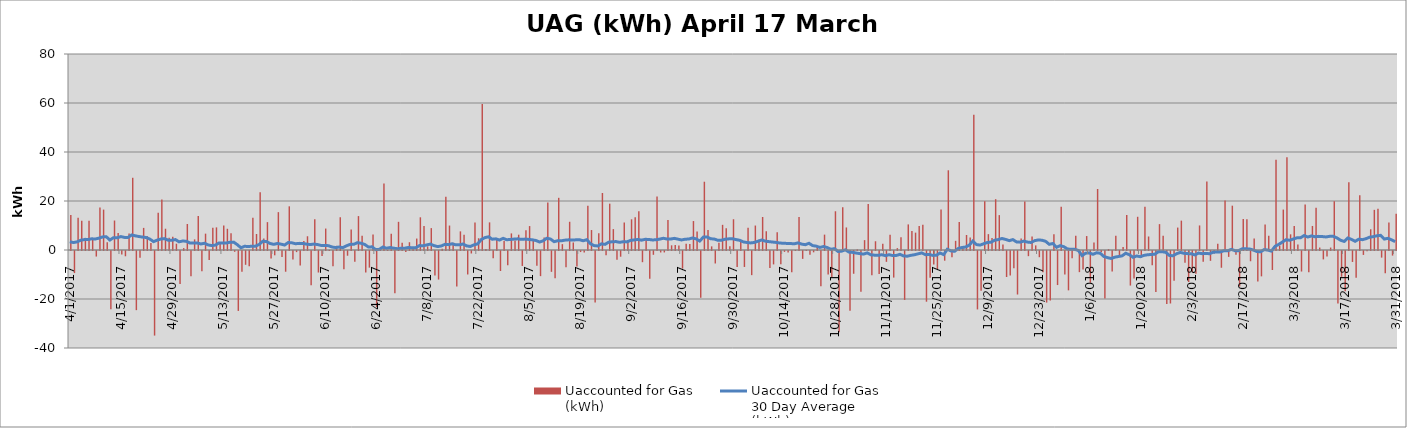
| Category | Uaccounted for Gas 
(kWh) |
|---|---|
| 0 | 14314398 |
| 1/1/00 | -9008049 |
| 1/2/00 | 13165006 |
| 1/3/00 | 11980030 |
| 1/4/00 | 4963694 |
| 1/5/00 | 11972930 |
| 1/6/00 | 4284250 |
| 1/7/00 | -2266329 |
| 1/8/00 | 17318408 |
| 1/9/00 | 16489319 |
| 1/10/00 | 3201172 |
| 1/11/00 | -23783681 |
| 1/12/00 | 12033013 |
| 1/13/00 | 6946573 |
| 1/14/00 | -1398838 |
| 1/15/00 | -2153866 |
| 1/16/00 | 6734255 |
| 1/17/00 | 29477750 |
| 1/18/00 | -24142769 |
| 1/19/00 | -2755645 |
| 1/20/00 | 9024930 |
| 1/21/00 | 5632530 |
| 1/22/00 | 2838750 |
| 1/23/00 | -34522814 |
| 1/24/00 | 15181135 |
| 1/25/00 | 20662476 |
| 1/26/00 | 8684997 |
| 1/27/00 | 5012384 |
| 1/28/00 | 5452508 |
| 1/29/00 | 2561052 |
| 1/30/00 | -13436861 |
| 1/31/00 | 770855 |
| 2/1/00 | 10612207 |
| 2/2/00 | -10261923 |
| 2/3/00 | 4332814 |
| 2/4/00 | 13850251 |
| 2/5/00 | -8300941 |
| 2/6/00 | 6675173 |
| 2/7/00 | -3719255 |
| 2/8/00 | 9099015 |
| 2/9/00 | 9231356 |
| 2/10/00 | 2527529 |
| 2/11/00 | 9999616 |
| 2/12/00 | 8661983 |
| 2/13/00 | 6830649 |
| 2/14/00 | -319115 |
| 2/15/00 | -24456047 |
| 2/16/00 | -8495750 |
| 2/17/00 | -5634607 |
| 2/18/00 | -6268354 |
| 2/19/00 | 13211002 |
| 2/20/00 | 6520097 |
| 2/21/00 | 23588603 |
| 2/22/00 | 4718145 |
| 2/23/00 | 11375251 |
| 2/24/00 | -3104794 |
| 2/25/00 | -1764475 |
| 2/26/00 | 15451648 |
| 2/27/00 | -2454022 |
| 2/28/00 | -8458312 |
| 2/28/00 | 17828688 |
| 3/1/00 | -3469632 |
| 3/2/00 | -459033 |
| 3/3/00 | -5878953 |
| 3/4/00 | 3650271 |
| 3/5/00 | 5610271 |
| 3/6/00 | -14008154 |
| 3/7/00 | 12502707 |
| 3/8/00 | -8779890 |
| 3/9/00 | -2033755 |
| 3/10/00 | 8749149 |
| 3/11/00 | 74535 |
| 3/12/00 | -6268696 |
| 3/13/00 | 1711995 |
| 3/14/00 | 13371018 |
| 3/15/00 | -7479051 |
| 3/16/00 | -1931623 |
| 3/17/00 | 8329411 |
| 3/18/00 | -4363870 |
| 3/19/00 | 13840853 |
| 3/20/00 | 5807262 |
| 3/21/00 | -8752586 |
| 3/22/00 | -6791870 |
| 3/23/00 | 6328985 |
| 3/24/00 | -22918268 |
| 3/25/00 | 485343 |
| 3/26/00 | 27146947 |
| 3/27/00 | -11687 |
| 3/28/00 | 6641294 |
| 3/29/00 | -17247993 |
| 3/30/00 | 11500662 |
| 3/31/00 | 2912392 |
| 4/1/00 | -404406 |
| 4/2/00 | 3172298 |
| 4/3/00 | 457996 |
| 4/4/00 | 4668359 |
| 4/5/00 | 13345374 |
| 4/6/00 | 9758940 |
| 4/7/00 | 1476730 |
| 4/8/00 | 8936574 |
| 4/9/00 | -9950012 |
| 4/10/00 | -11652063 |
| 4/11/00 | 539320 |
| 4/12/00 | 21740747 |
| 4/13/00 | 9982116 |
| 4/14/00 | 2991532 |
| 4/15/00 | -14452145 |
| 4/16/00 | 7608446 |
| 4/17/00 | 6256930 |
| 4/18/00 | -9582820 |
| 4/19/00 | -1008950 |
| 4/20/00 | 11177220 |
| 4/21/00 | 4790190 |
| 4/22/00 | 59561910 |
| 4/23/00 | 411091 |
| 4/24/00 | 11280591 |
| 4/25/00 | -2969818 |
| 4/26/00 | 4697754 |
| 4/27/00 | -8173841 |
| 4/28/00 | 3713432 |
| 4/29/00 | -5779908 |
| 4/30/00 | 6777965 |
| 5/1/00 | 3865953 |
| 5/2/00 | 6247170 |
| 5/3/00 | -6100718 |
| 5/4/00 | 8058457 |
| 5/5/00 | 9769337 |
| 5/6/00 | 4290131 |
| 5/7/00 | -6012798 |
| 5/8/00 | -10263490 |
| 5/9/00 | 5130785 |
| 5/10/00 | 19347697 |
| 5/11/00 | -8506058 |
| 5/12/00 | -11088056 |
| 5/13/00 | 21298585 |
| 5/14/00 | 2395089 |
| 5/15/00 | -6582632 |
| 5/16/00 | 11526047 |
| 5/17/00 | 3065625 |
| 5/18/00 | -6377373 |
| 5/19/00 | -427718 |
| 5/20/00 | -661129 |
| 5/21/00 | 18014997 |
| 5/22/00 | 8147501 |
| 5/23/00 | -21000124 |
| 5/24/00 | 6871303 |
| 5/25/00 | 23259332 |
| 5/26/00 | -1778904 |
| 5/27/00 | 18914307 |
| 5/28/00 | 8528696 |
| 5/29/00 | -3559892 |
| 5/30/00 | -2331214 |
| 5/31/00 | 11199562 |
| 6/1/00 | 4073972 |
| 6/2/00 | 12524235 |
| 6/3/00 | 13402268 |
| 6/4/00 | 15819304 |
| 6/5/00 | -4565296 |
| 6/6/00 | 4160880 |
| 6/7/00 | -11291859 |
| 6/8/00 | -1553730 |
| 6/9/00 | 21791669 |
| 6/10/00 | -605213 |
| 6/11/00 | -586590 |
| 6/12/00 | 12234947 |
| 6/13/00 | 1906386 |
| 6/14/00 | 2003831 |
| 6/15/00 | 1872748 |
| 6/16/00 | -7165082 |
| 6/17/00 | 2569217 |
| 6/18/00 | 2414710 |
| 6/19/00 | 11816762 |
| 6/20/00 | 7525037 |
| 6/21/00 | -19128985 |
| 6/22/00 | 27869538 |
| 6/23/00 | 8145679 |
| 6/24/00 | 1481253 |
| 6/25/00 | -5093882 |
| 6/26/00 | 2915495 |
| 6/27/00 | 10276742 |
| 6/28/00 | 8911532 |
| 6/29/00 | 1497062 |
| 6/30/00 | 12554489 |
| 7/1/00 | -6485437 |
| 7/2/00 | 3823073 |
| 7/3/00 | -6516055 |
| 7/4/00 | 9043366 |
| 7/5/00 | -9853089 |
| 7/6/00 | 9982055 |
| 7/7/00 | 4176250 |
| 7/8/00 | 13480566 |
| 7/9/00 | 7656649 |
| 7/10/00 | -6893459 |
| 7/11/00 | -5473824 |
| 7/12/00 | 7222282 |
| 7/13/00 | -5451179 |
| 7/14/00 | -360365 |
| 7/15/00 | -635175 |
| 7/16/00 | -8703687 |
| 7/17/00 | 50713 |
| 7/18/00 | 13498452 |
| 7/19/00 | -3209181 |
| 7/20/00 | 37938 |
| 7/21/00 | -1531223 |
| 7/22/00 | -542519 |
| 7/23/00 | 1381128 |
| 7/24/00 | -14429932 |
| 7/25/00 | 6273827 |
| 7/26/00 | -9568338 |
| 7/27/00 | -10631093 |
| 7/28/00 | 15810011 |
| 7/29/00 | -33182493 |
| 7/30/00 | 17435871 |
| 7/31/00 | 9202714 |
| 8/1/00 | -24349058 |
| 8/2/00 | -9289946 |
| 8/3/00 | 247624 |
| 8/4/00 | -16643883 |
| 8/5/00 | 4031816 |
| 8/6/00 | 18784913 |
| 8/7/00 | -9860922 |
| 8/8/00 | 3570291 |
| 8/9/00 | -9358517 |
| 8/10/00 | 2527235 |
| 8/11/00 | -4424857 |
| 8/12/00 | 6232661 |
| 8/13/00 | -10852350 |
| 8/14/00 | 761097 |
| 8/15/00 | 5192391 |
| 8/16/00 | -19963240 |
| 8/17/00 | 10444669 |
| 8/18/00 | 7754229 |
| 8/19/00 | 7087094 |
| 8/20/00 | 9791004 |
| 8/21/00 | 10286689 |
| 8/22/00 | -20696026 |
| 8/23/00 | -10927548 |
| 8/24/00 | -5494994 |
| 8/25/00 | -7370713 |
| 8/26/00 | 16500524 |
| 8/27/00 | -3959574 |
| 8/28/00 | 32536026 |
| 8/29/00 | -2517418 |
| 8/30/00 | 3740842 |
| 8/31/00 | 11384513 |
| 9/1/00 | 1649723 |
| 9/2/00 | 6117443 |
| 9/3/00 | 5057684 |
| 9/4/00 | 55199323 |
| 9/5/00 | -23847299 |
| 9/6/00 | -16265439 |
| 9/7/00 | 19924133 |
| 9/8/00 | 6474109 |
| 9/9/00 | 4924506 |
| 9/10/00 | 20741360 |
| 9/11/00 | 14241737 |
| 9/12/00 | 2219157 |
| 9/13/00 | -10622514 |
| 9/14/00 | -9996465 |
| 9/15/00 | -6998770 |
| 9/16/00 | -17760673 |
| 9/17/00 | 4675197 |
| 9/18/00 | 19775008 |
| 9/19/00 | -2107006 |
| 9/20/00 | 5489507 |
| 9/21/00 | 1878752 |
| 9/22/00 | -2531172 |
| 9/23/00 | -8712952 |
| 9/24/00 | -21051382 |
| 9/25/00 | -20212140 |
| 9/26/00 | 6397294 |
| 9/27/00 | -13893722 |
| 9/28/00 | 17624793 |
| 9/29/00 | -9542029 |
| 9/30/00 | -16061899 |
| 10/1/00 | -2973911 |
| 10/2/00 | 5819391 |
| 10/3/00 | -8630135 |
| 10/4/00 | -7584058 |
| 10/5/00 | 5692742 |
| 10/6/00 | -12970607 |
| 10/7/00 | 3103714 |
| 10/8/00 | 24895995 |
| 10/9/00 | -458447 |
| 10/10/00 | -19369546 |
| 10/11/00 | 391145 |
| 10/12/00 | -8393638 |
| 10/13/00 | 5816280 |
| 10/14/00 | -2131074 |
| 10/15/00 | 1200884 |
| 10/16/00 | 14297902 |
| 10/17/00 | -14105827 |
| 10/18/00 | -11191914 |
| 10/19/00 | 13555663 |
| 10/20/00 | -2736173 |
| 10/21/00 | 17634985 |
| 10/22/00 | 5514267 |
| 10/23/00 | -5816082 |
| 10/24/00 | -16685565 |
| 10/25/00 | 10559687 |
| 10/26/00 | 5801833 |
| 10/27/00 | -21658925 |
| 10/28/00 | -21423684 |
| 10/29/00 | -12113338 |
| 10/30/00 | 9154710 |
| 10/31/00 | 11988677 |
| 11/1/00 | -4786251 |
| 11/2/00 | -12660129 |
| 11/3/00 | -8682874 |
| 11/4/00 | -9267526 |
| 11/5/00 | 10022840 |
| 11/6/00 | -4350055 |
| 11/7/00 | 27976623 |
| 11/8/00 | -4016519 |
| 11/9/00 | -1003294 |
| 11/10/00 | 2554194 |
| 11/11/00 | -6839281 |
| 11/12/00 | 20212496 |
| 11/13/00 | -2401877 |
| 11/14/00 | 18092024 |
| 11/15/00 | -1532210 |
| 11/16/00 | -14490500 |
| 11/17/00 | 12657615 |
| 11/18/00 | 12566486 |
| 11/19/00 | -4184086 |
| 11/20/00 | 4724286 |
| 11/21/00 | -12441508 |
| 11/22/00 | -10350051 |
| 11/23/00 | 10396619 |
| 11/24/00 | 5786881 |
| 11/25/00 | -7761996 |
| 11/26/00 | 36860203 |
| 11/27/00 | 1790394 |
| 11/28/00 | 16501379 |
| 11/29/00 | 37815424 |
| 11/30/00 | 6396415 |
| 12/1/00 | 9830526 |
| 12/2/00 | 2231617 |
| 12/3/00 | -8380362 |
| 12/4/00 | 18581279 |
| 12/5/00 | -8711146 |
| 12/6/00 | 9811456 |
| 12/7/00 | 17227780 |
| 12/8/00 | 999669 |
| 12/9/00 | -3428149 |
| 12/10/00 | -2258976 |
| 12/11/00 | 1003160 |
| 12/12/00 | 19906432 |
| 12/13/00 | -21393498 |
| 12/14/00 | -10511738 |
| 12/15/00 | -16468987 |
| 12/16/00 | 27645247 |
| 12/17/00 | -4471109 |
| 12/18/00 | -10953338 |
| 12/19/00 | 22338285 |
| 12/20/00 | -1602855 |
| 12/21/00 | -150332 |
| 12/22/00 | 8469965 |
| 12/23/00 | 16387157 |
| 12/24/00 | 16798925 |
| 12/25/00 | -2700137 |
| 12/26/00 | -9084556 |
| 12/27/00 | 11199280 |
| 12/28/00 | -1876790 |
| 12/29/00 | 14758782 |